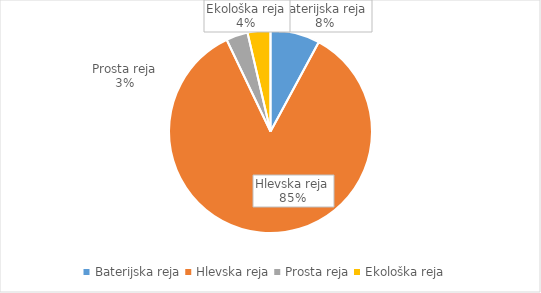
| Category | Količina kosov jajc |
|---|---|
| Baterijska reja | 237649 |
| Hlevska reja | 2564354 |
| Prosta reja | 104288 |
| Ekološka reja | 109800 |